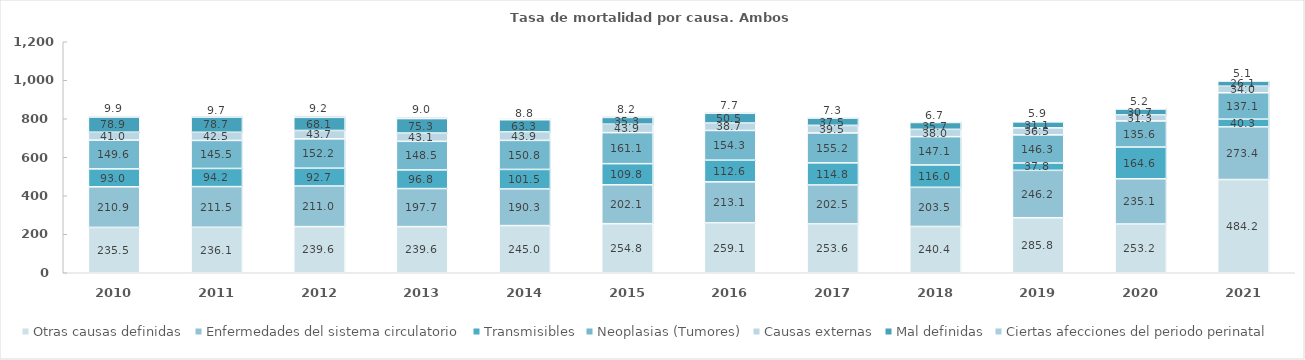
| Category | Otras causas definidas | Enfermedades del sistema circulatorio | Transmisibles | Neoplasias (Tumores) | Causas externas | Mal definidas | Ciertas afecciones del periodo perinatal |
|---|---|---|---|---|---|---|---|
| 2010.0 | 235.548 | 210.881 | 93.027 | 149.577 | 41.026 | 78.883 | 9.868 |
| 2011.0 | 236.128 | 211.514 | 94.163 | 145.459 | 42.496 | 78.657 | 9.686 |
| 2012.0 | 239.637 | 211.004 | 92.686 | 152.168 | 43.713 | 68.103 | 9.242 |
| 2013.0 | 239.65 | 197.691 | 96.798 | 148.518 | 43.144 | 75.25 | 8.957 |
| 2014.0 | 245.021 | 190.275 | 101.523 | 150.751 | 43.942 | 63.304 | 8.788 |
| 2015.0 | 254.809 | 202.138 | 109.832 | 161.111 | 43.884 | 35.252 | 8.193 |
| 2016.0 | 259.08 | 213.115 | 112.629 | 154.313 | 38.697 | 50.519 | 7.713 |
| 2017.0 | 253.596 | 202.515 | 114.765 | 155.241 | 39.471 | 37.509 | 7.315 |
| 2018.0 | 240.411 | 203.473 | 116.024 | 147.101 | 37.985 | 35.682 | 6.682 |
| 2019.0 | 285.824 | 246.187 | 37.835 | 146.337 | 36.522 | 31.071 | 5.895 |
| 2020.0 | 253.213 | 235.067 | 164.649 | 135.603 | 31.304 | 30.705 | 5.199 |
| 2021.0 | 484.195 | 273.434 | 40.3 | 137.067 | 34.01 | 26.088 | 5.116 |